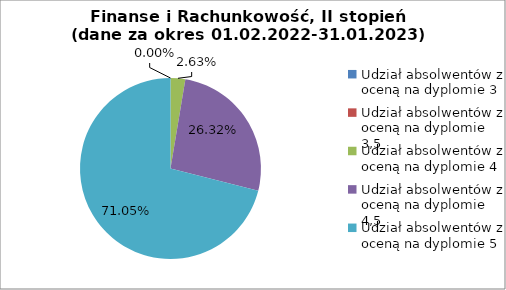
| Category | Series 0 |
|---|---|
| Udział absolwentów z oceną na dyplomie 3 | 0 |
| Udział absolwentów z oceną na dyplomie 3,5 | 0 |
| Udział absolwentów z oceną na dyplomie 4 | 2.632 |
| Udział absolwentów z oceną na dyplomie 4,5 | 26.316 |
| Udział absolwentów z oceną na dyplomie 5 | 71.053 |